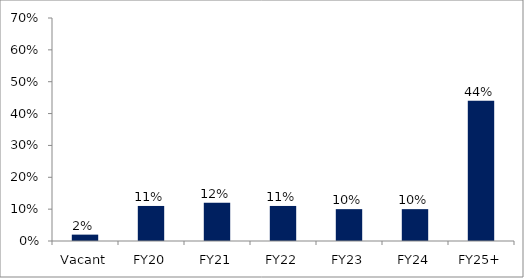
| Category | Series 0 |
|---|---|
| Vacant | 0.02 |
| FY20 | 0.11 |
| FY21 | 0.12 |
| FY22 | 0.11 |
| FY23 | 0.1 |
| FY24 | 0.1 |
| FY25+ | 0.44 |